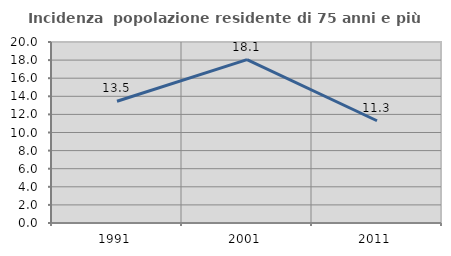
| Category | Incidenza  popolazione residente di 75 anni e più |
|---|---|
| 1991.0 | 13.452 |
| 2001.0 | 18.06 |
| 2011.0 | 11.298 |